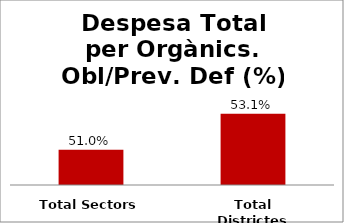
| Category | Series 0 |
|---|---|
| Total Sectors | 0.51 |
| Total Districtes | 0.531 |